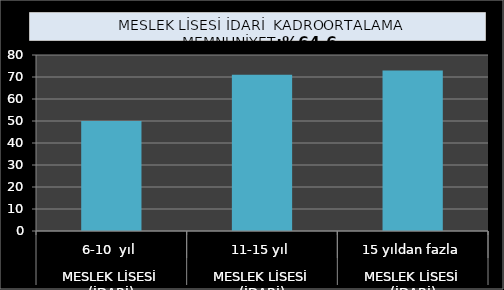
| Category | Series 0 |
|---|---|
| 0 | 50 |
| 1 | 71 |
| 2 | 73 |